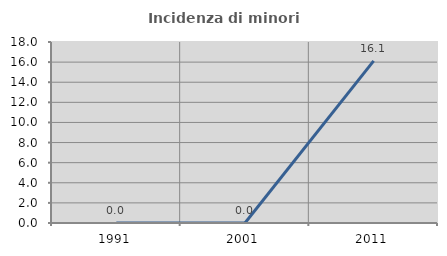
| Category | Incidenza di minori stranieri |
|---|---|
| 1991.0 | 0 |
| 2001.0 | 0 |
| 2011.0 | 16.129 |